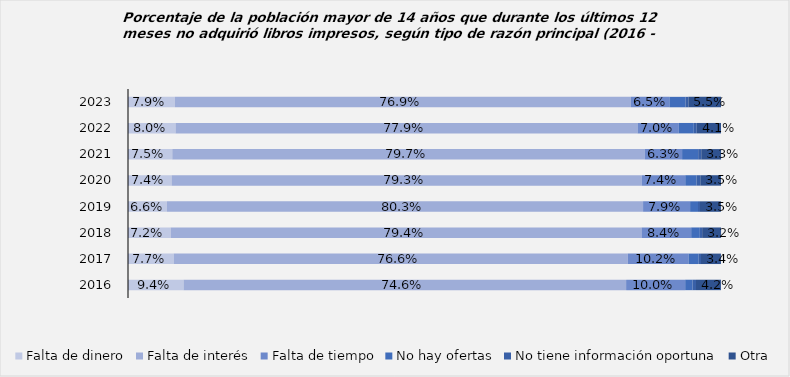
| Category | Falta de dinero | Falta de interés | Falta de tiempo | No hay ofertas | No tiene información oportuna | Otra |
|---|---|---|---|---|---|---|
| 2023.0 | 0.079 | 0.769 | 0.065 | 0.027 | 0.005 | 0.055 |
| 2022.0 | 0.08 | 0.779 | 0.07 | 0.025 | 0.005 | 0.041 |
| 2021.0 | 0.075 | 0.796 | 0.063 | 0.027 | 0.005 | 0.033 |
| 2020.0 | 0.074 | 0.793 | 0.074 | 0.019 | 0.006 | 0.035 |
| 2019.0 | 0.066 | 0.803 | 0.079 | 0.013 | 0.003 | 0.035 |
| 2018.0 | 0.072 | 0.794 | 0.084 | 0.015 | 0.004 | 0.032 |
| 2017.0 | 0.077 | 0.766 | 0.102 | 0.017 | 0.004 | 0.034 |
| 2016.0 | 0.094 | 0.746 | 0.1 | 0.012 | 0.006 | 0.042 |